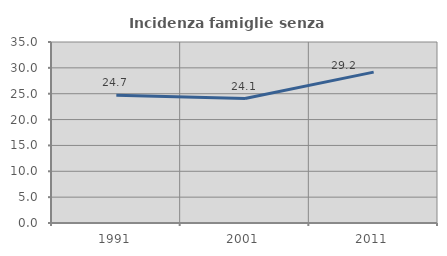
| Category | Incidenza famiglie senza nuclei |
|---|---|
| 1991.0 | 24.704 |
| 2001.0 | 24.074 |
| 2011.0 | 29.178 |